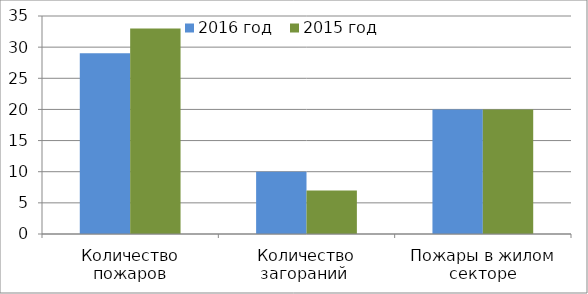
| Category | 2016 год | 2015 год |
|---|---|---|
| Количество пожаров | 29 | 33 |
| Количество загораний  | 10 | 7 |
| Пожары в жилом секторе | 20 | 20 |